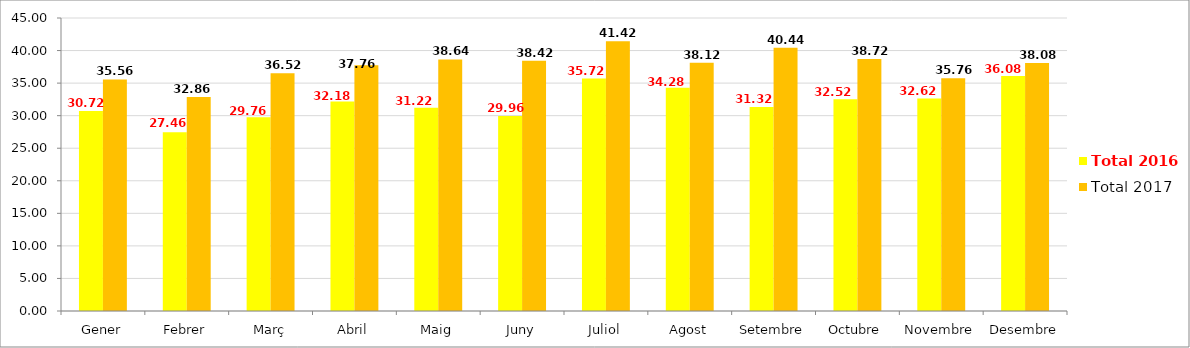
| Category | Total 2016 | Total 2017 |
|---|---|---|
| Gener | 30.72 | 35.56 |
| Febrer | 27.46 | 32.86 |
| Març | 29.76 | 36.52 |
| Abril | 32.18 | 37.76 |
| Maig | 31.22 | 38.64 |
| Juny | 29.96 | 38.42 |
| Juliol | 35.72 | 41.42 |
| Agost | 34.28 | 38.12 |
| Setembre | 31.32 | 40.44 |
| Octubre | 32.52 | 38.72 |
| Novembre | 32.619 | 35.76 |
| Desembre | 36.08 | 38.08 |